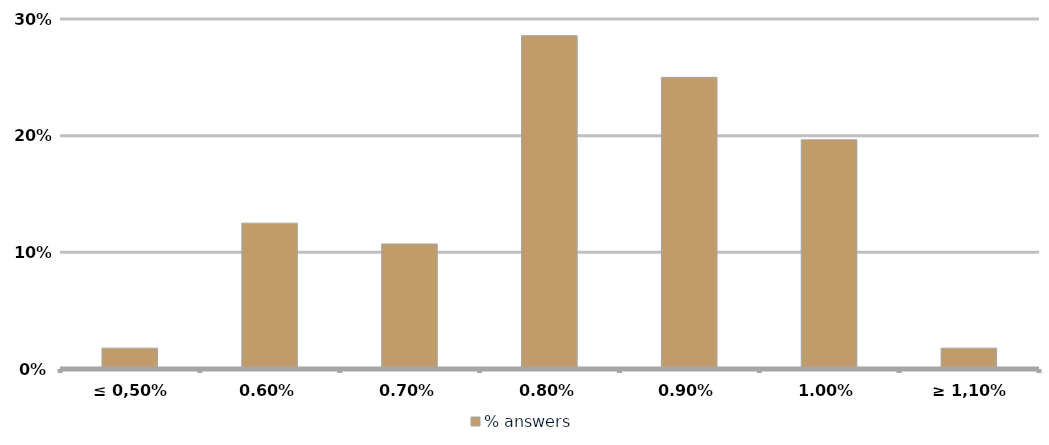
| Category | % answers |
|---|---|
| ≤ 0,50% | 0.018 |
| 0,60% | 0.125 |
| 0,70% | 0.107 |
| 0,80% | 0.286 |
| 0,90% | 0.25 |
| 1,00% | 0.196 |
| ≥ 1,10% | 0.018 |